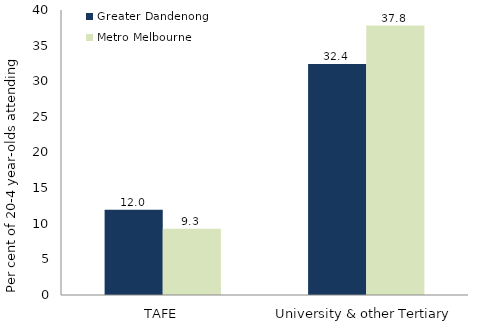
| Category | Greater Dandenong  | Metro Melbourne |
|---|---|---|
| TAFE | 11.956 | 9.297 |
| University & other Tertiary | 32.409 | 37.818 |